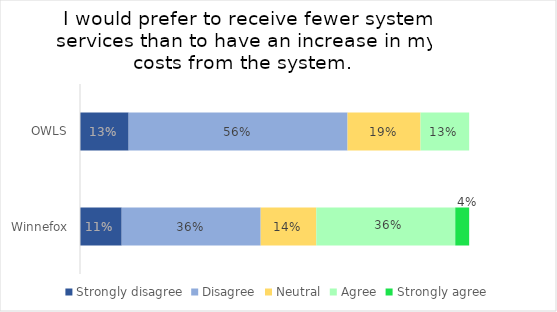
| Category | Strongly disagree | Disagree | Neutral | Agree | Strongly agree |
|---|---|---|---|---|---|
| OWLS | 0.125 | 0.562 | 0.188 | 0.125 | 0 |
| Winnefox | 0.107 | 0.357 | 0.143 | 0.357 | 0.036 |